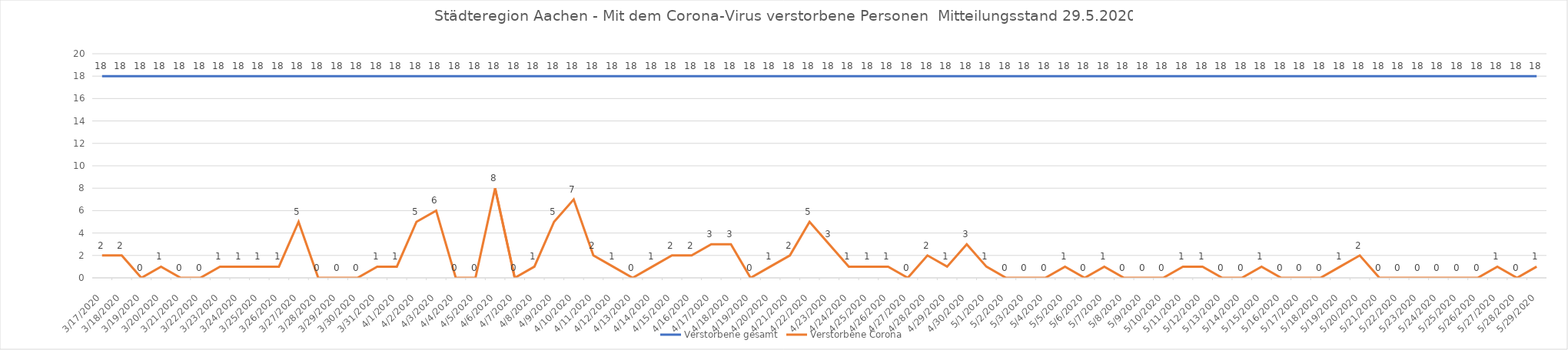
| Category | Verstorbene gesamt | Verstorbene Corona |
|---|---|---|
| 3/17/20 | 18 | 2 |
| 3/18/20 | 18 | 2 |
| 3/19/20 | 18 | 0 |
| 3/20/20 | 18 | 1 |
| 3/21/20 | 18 | 0 |
| 3/22/20 | 18 | 0 |
| 3/23/20 | 18 | 1 |
| 3/24/20 | 18 | 1 |
| 3/25/20 | 18 | 1 |
| 3/26/20 | 18 | 1 |
| 3/27/20 | 18 | 5 |
| 3/28/20 | 18 | 0 |
| 3/29/20 | 18 | 0 |
| 3/30/20 | 18 | 0 |
| 3/31/20 | 18 | 1 |
| 4/1/20 | 18 | 1 |
| 4/2/20 | 18 | 5 |
| 4/3/20 | 18 | 6 |
| 4/4/20 | 18 | 0 |
| 4/5/20 | 18 | 0 |
| 4/6/20 | 18 | 8 |
| 4/7/20 | 18 | 0 |
| 4/8/20 | 18 | 1 |
| 4/9/20 | 18 | 5 |
| 4/10/20 | 18 | 7 |
| 4/11/20 | 18 | 2 |
| 4/12/20 | 18 | 1 |
| 4/13/20 | 18 | 0 |
| 4/14/20 | 18 | 1 |
| 4/15/20 | 18 | 2 |
| 4/16/20 | 18 | 2 |
| 4/17/20 | 18 | 3 |
| 4/18/20 | 18 | 3 |
| 4/19/20 | 18 | 0 |
| 4/20/20 | 18 | 1 |
| 4/21/20 | 18 | 2 |
| 4/22/20 | 18 | 5 |
| 4/23/20 | 18 | 3 |
| 4/24/20 | 18 | 1 |
| 4/25/20 | 18 | 1 |
| 4/26/20 | 18 | 1 |
| 4/27/20 | 18 | 0 |
| 4/28/20 | 18 | 2 |
| 4/29/20 | 18 | 1 |
| 4/30/20 | 18 | 3 |
| 5/1/20 | 18 | 1 |
| 5/2/20 | 18 | 0 |
| 5/3/20 | 18 | 0 |
| 5/4/20 | 18 | 0 |
| 5/5/20 | 18 | 1 |
| 5/6/20 | 18 | 0 |
| 5/7/20 | 18 | 1 |
| 5/8/20 | 18 | 0 |
| 5/9/20 | 18 | 0 |
| 5/10/20 | 18 | 0 |
| 5/11/20 | 18 | 1 |
| 5/12/20 | 18 | 1 |
| 5/13/20 | 18 | 0 |
| 5/14/20 | 18 | 0 |
| 5/15/20 | 18 | 1 |
| 5/16/20 | 18 | 0 |
| 5/17/20 | 18 | 0 |
| 5/18/20 | 18 | 0 |
| 5/19/20 | 18 | 1 |
| 5/20/20 | 18 | 2 |
| 5/21/20 | 18 | 0 |
| 5/22/20 | 18 | 0 |
| 5/23/20 | 18 | 0 |
| 5/24/20 | 18 | 0 |
| 5/25/20 | 18 | 0 |
| 5/26/20 | 18 | 0 |
| 5/27/20 | 18 | 1 |
| 5/28/20 | 18 | 0 |
| 5/29/20 | 18 | 1 |